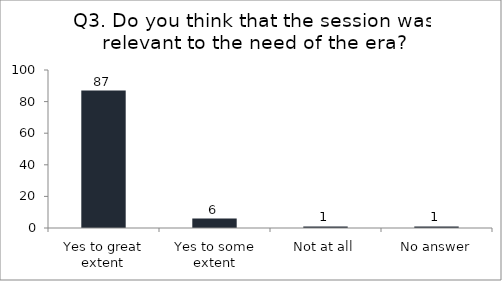
| Category | Q3. Do you think that the session was relevant to the need of the era? |
|---|---|
| Yes to great extent | 87 |
| Yes to some extent | 6 |
| Not at all | 1 |
| No answer | 1 |